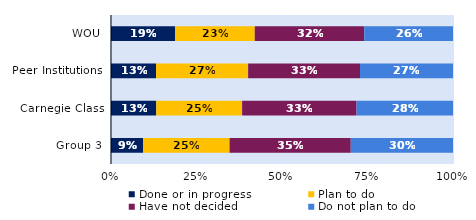
| Category | Done or in progress | Plan to do | Have not decided | Do not plan to do |
|---|---|---|---|---|
| WOU | 0.187 | 0.233 | 0.32 | 0.26 |
| Peer Institutions | 0.132 | 0.269 | 0.327 | 0.272 |
| Carnegie Class | 0.132 | 0.251 | 0.335 | 0.282 |
| Group 3 | 0.094 | 0.253 | 0.354 | 0.299 |